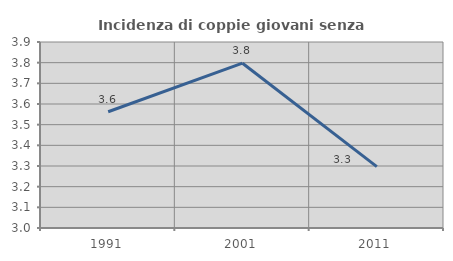
| Category | Incidenza di coppie giovani senza figli |
|---|---|
| 1991.0 | 3.562 |
| 2001.0 | 3.797 |
| 2011.0 | 3.297 |